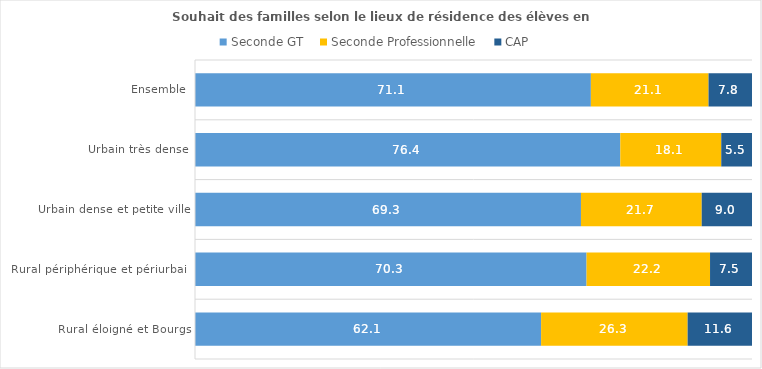
| Category | Seconde GT | Seconde Professionnelle | CAP |
|---|---|---|---|
| Rural éloigné et Bourgs | 62.137 | 26.307 | 11.557 |
| Rural périphérique et périurbain | 70.298 | 22.168 | 7.534 |
| Urbain dense et petite ville | 69.295 | 21.677 | 9.028 |
| Urbain très dense | 76.355 | 18.127 | 5.518 |
| Ensemble | 71.075 | 21.122 | 7.803 |